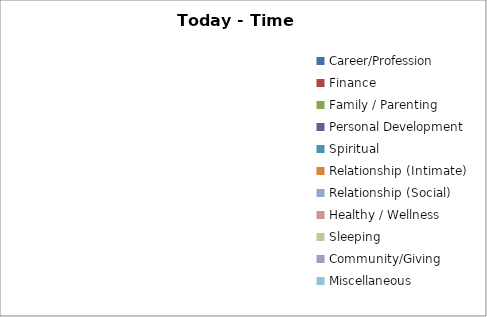
| Category | Series 1 | Series 0 |
|---|---|---|
| Career/Profession | 0 |  |
| Finance | 0 |  |
| Family / Parenting | 0 |  |
| Personal Development | 0 |  |
| Spiritual | 0 |  |
| Relationship (Intimate) | 0 |  |
| Relationship (Social) | 0 |  |
| Healthy / Wellness | 0 |  |
| Sleeping | 0 |  |
| Community/Giving | 0 |  |
| Miscellaneous | 0 |  |